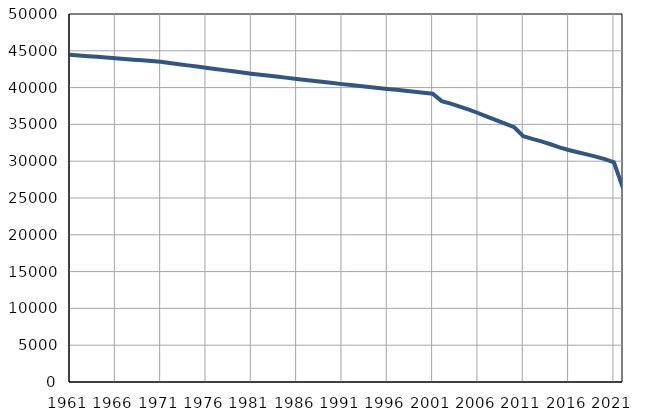
| Category | Број
становника |
|---|---|
| 1961.0 | 44466 |
| 1962.0 | 44370 |
| 1963.0 | 44274 |
| 1964.0 | 44179 |
| 1965.0 | 44083 |
| 1966.0 | 43987 |
| 1967.0 | 43891 |
| 1968.0 | 43795 |
| 1969.0 | 43700 |
| 1970.0 | 43604 |
| 1971.0 | 43508 |
| 1972.0 | 43346 |
| 1973.0 | 43184 |
| 1974.0 | 43022 |
| 1975.0 | 42860 |
| 1976.0 | 42699 |
| 1977.0 | 42537 |
| 1978.0 | 42374 |
| 1979.0 | 42213 |
| 1980.0 | 42050 |
| 1981.0 | 41889 |
| 1982.0 | 41747 |
| 1983.0 | 41606 |
| 1984.0 | 41464 |
| 1985.0 | 41323 |
| 1986.0 | 41181 |
| 1987.0 | 41040 |
| 1988.0 | 40898 |
| 1989.0 | 40757 |
| 1990.0 | 40615 |
| 1991.0 | 40473 |
| 1992.0 | 40343 |
| 1993.0 | 40213 |
| 1994.0 | 40083 |
| 1995.0 | 39953 |
| 1996.0 | 39823 |
| 1997.0 | 39694 |
| 1998.0 | 39564 |
| 1999.0 | 39434 |
| 2000.0 | 39304 |
| 2001.0 | 39174 |
| 2002.0 | 38162 |
| 2003.0 | 37824 |
| 2004.0 | 37427 |
| 2005.0 | 37005 |
| 2006.0 | 36550 |
| 2007.0 | 36051 |
| 2008.0 | 35575 |
| 2009.0 | 35099 |
| 2010.0 | 34611 |
| 2011.0 | 33407 |
| 2012.0 | 33028 |
| 2013.0 | 32689 |
| 2014.0 | 32305 |
| 2015.0 | 31884 |
| 2016.0 | 31517 |
| 2017.0 | 31210 |
| 2018.0 | 30927 |
| 2019.0 | 30628 |
| 2020.0 | 30279 |
| 2021.0 | 29853 |
| 2022.0 | 26345 |